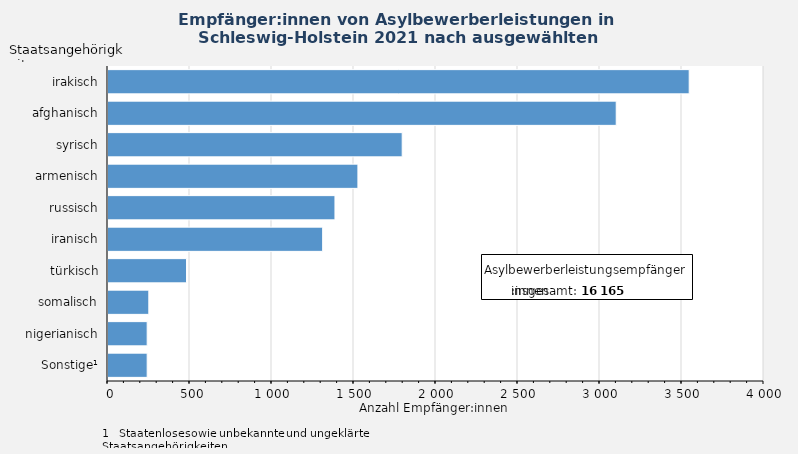
| Category | Anzahl Empfänger:innen |
|---|---|
| irakisch | 3550 |
| afghanisch | 3105 |
| syrisch | 1800 |
| armenisch | 1530 |
| russisch | 1390 |
| iranisch | 1315 |
| türkisch | 485 |
| somalisch | 255 |
| nigerianisch | 245 |
| Sonstige¹ | 245 |